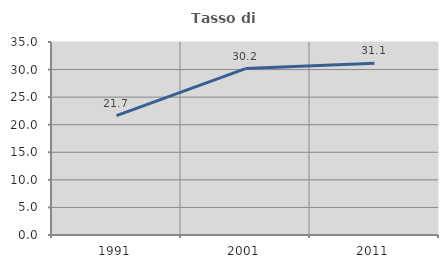
| Category | Tasso di occupazione   |
|---|---|
| 1991.0 | 21.663 |
| 2001.0 | 30.174 |
| 2011.0 | 31.139 |